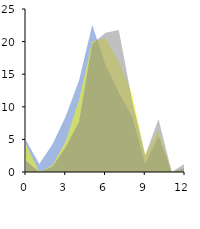
| Category | nov.2021 | dic.2021 | ene.2022 |
|---|---|---|---|
| 0.0 | 4.878 | 4.211 | 1.709 |
| 1.0 | 1.22 | 0 | 0 |
| 2.0 | 4.268 | 1.053 | 0.855 |
| 3.0 | 8.537 | 4.737 | 3.846 |
| 4.0 | 14.024 | 11.053 | 7.692 |
| 5.0 | 22.561 | 20 | 19.658 |
| 6.0 | 16.463 | 20.526 | 21.368 |
| 7.0 | 12.195 | 16.842 | 21.795 |
| 8.0 | 8.537 | 12.105 | 11.111 |
| 9.0 | 1.22 | 2.632 | 2.564 |
| 10.0 | 5.488 | 6.316 | 8.12 |
| 11.0 | 0 | 0 | 0 |
| 12.0 | 0.61 | 0.526 | 1.282 |